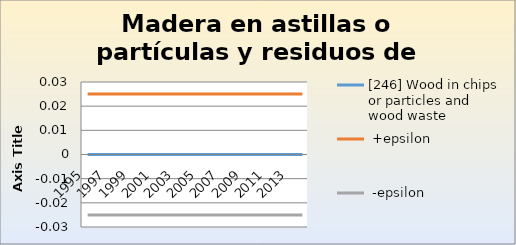
| Category | [246] Wood in chips or particles and wood waste |  +epsilon |  -epsilon |
|---|---|---|---|
| 1995.0 | 0 | 0.025 | -0.025 |
| 1996.0 | 0 | 0.025 | -0.025 |
| 1997.0 | 0 | 0.025 | -0.025 |
| 1998.0 | 0 | 0.025 | -0.025 |
| 1999.0 | 0 | 0.025 | -0.025 |
| 2000.0 | 0 | 0.025 | -0.025 |
| 2001.0 | 0 | 0.025 | -0.025 |
| 2002.0 | 0 | 0.025 | -0.025 |
| 2003.0 | 0 | 0.025 | -0.025 |
| 2004.0 | 0 | 0.025 | -0.025 |
| 2005.0 | 0 | 0.025 | -0.025 |
| 2006.0 | 0 | 0.025 | -0.025 |
| 2007.0 | 0 | 0.025 | -0.025 |
| 2008.0 | 0 | 0.025 | -0.025 |
| 2009.0 | 0 | 0.025 | -0.025 |
| 2010.0 | 0 | 0.025 | -0.025 |
| 2011.0 | 0 | 0.025 | -0.025 |
| 2012.0 | 0 | 0.025 | -0.025 |
| 2013.0 | 0 | 0.025 | -0.025 |
| 2014.0 | 0 | 0.025 | -0.025 |